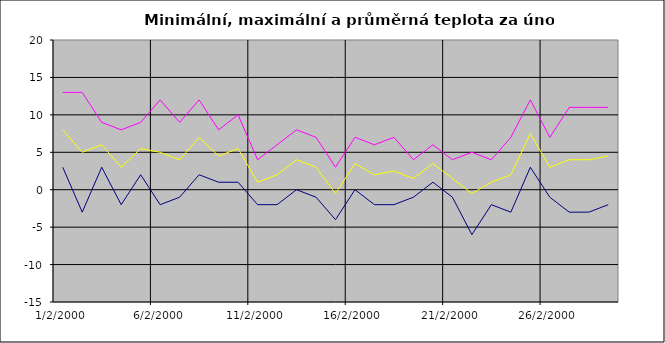
| Category | Series 0 | Series 1 | Series 2 |
|---|---|---|---|
| 2000-02-01 | 3 | 13 | 8 |
| 2000-02-02 | -3 | 13 | 5 |
| 2000-02-03 | 3 | 9 | 6 |
| 2000-02-04 | -2 | 8 | 3 |
| 2000-02-05 | 2 | 9 | 5.5 |
| 2000-02-06 | -2 | 12 | 5 |
| 2000-02-07 | -1 | 9 | 4 |
| 2000-02-08 | 2 | 12 | 7 |
| 2000-02-09 | 1 | 8 | 4.5 |
| 2000-02-10 | 1 | 10 | 5.5 |
| 2000-02-11 | -2 | 4 | 1 |
| 2000-02-12 | -2 | 6 | 2 |
| 2000-02-13 | 0 | 8 | 4 |
| 2000-02-14 | -1 | 7 | 3 |
| 2000-02-15 | -4 | 3 | -0.5 |
| 2000-02-16 | 0 | 7 | 3.5 |
| 2000-02-17 | -2 | 6 | 2 |
| 2000-02-18 | -2 | 7 | 2.5 |
| 2000-02-19 | -1 | 4 | 1.5 |
| 2000-02-20 | 1 | 6 | 3.5 |
| 2000-02-21 | -1 | 4 | 1.5 |
| 2000-02-22 | -6 | 5 | -0.5 |
| 2000-02-23 | -2 | 4 | 1 |
| 2000-02-24 | -3 | 7 | 2 |
| 2000-02-25 | 3 | 12 | 7.5 |
| 2000-02-26 | -1 | 7 | 3 |
| 2000-02-27 | -3 | 11 | 4 |
| 2000-02-28 | -3 | 11 | 4 |
| 2000-02-29 | -2 | 11 | 4.5 |